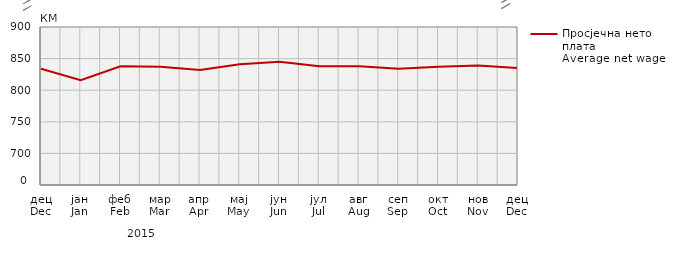
| Category | Просјечна нето плата
Average net wage |
|---|---|
| дец
Dec | 834 |
| јан
Jan | 816 |
| феб
Feb | 838 |
| мар
Mar | 837 |
| апр
Apr | 832 |
| мај
May | 841 |
| јун
Jun | 845 |
| јул
Jul | 838 |
| авг
Aug | 838 |
| сеп
Sep | 834 |
| окт
Oct | 837 |
| нов
Nov | 839 |
| дец
Dec | 835 |